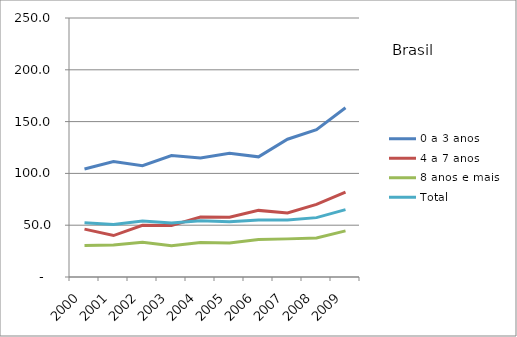
| Category | 0 a 3 anos | 4 a 7 anos | 8 anos e mais | Total |
|---|---|---|---|---|
| 2000.0 | 104.3 | 46.2 | 30.4 | 52.3 |
| 2001.0 | 111.5 | 40 | 30.9 | 50.6 |
| 2002.0 | 107.5 | 49.9 | 33.5 | 54.1 |
| 2003.0 | 117.2 | 49.7 | 30.2 | 52.1 |
| 2004.0 | 114.9 | 57.8 | 33.2 | 54.2 |
| 2005.0 | 119.4 | 57.7 | 32.8 | 53.4 |
| 2006.0 | 116 | 64.3 | 36.3 | 55.1 |
| 2007.0 | 133 | 61.9 | 36.8 | 55 |
| 2008.0 | 142.3 | 70.1 | 37.7 | 57.3 |
| 2009.0 | 163.3 | 81.9 | 44.5 | 65 |